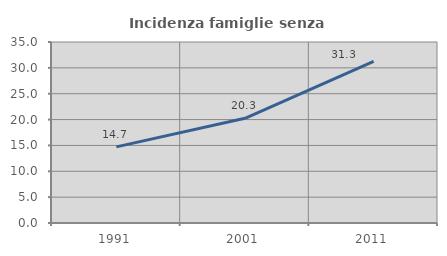
| Category | Incidenza famiglie senza nuclei |
|---|---|
| 1991.0 | 14.714 |
| 2001.0 | 20.253 |
| 2011.0 | 31.26 |